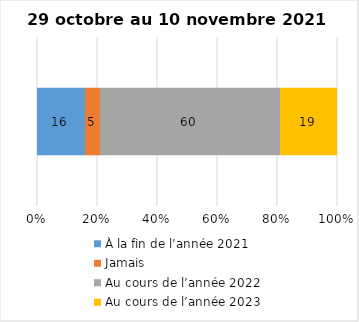
| Category | À la fin de l’année 2021 | Jamais | Au cours de l’année 2022 | Au cours de l’année 2023 |
|---|---|---|---|---|
| 0 | 16 | 5 | 60 | 19 |